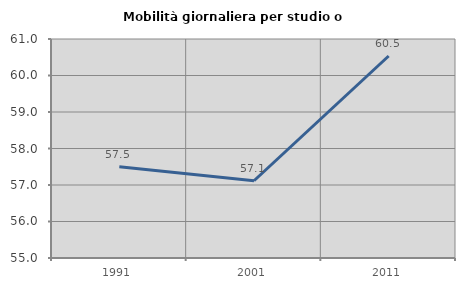
| Category | Mobilità giornaliera per studio o lavoro |
|---|---|
| 1991.0 | 57.499 |
| 2001.0 | 57.116 |
| 2011.0 | 60.535 |